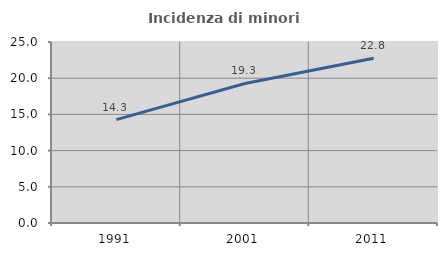
| Category | Incidenza di minori stranieri |
|---|---|
| 1991.0 | 14.286 |
| 2001.0 | 19.277 |
| 2011.0 | 22.754 |